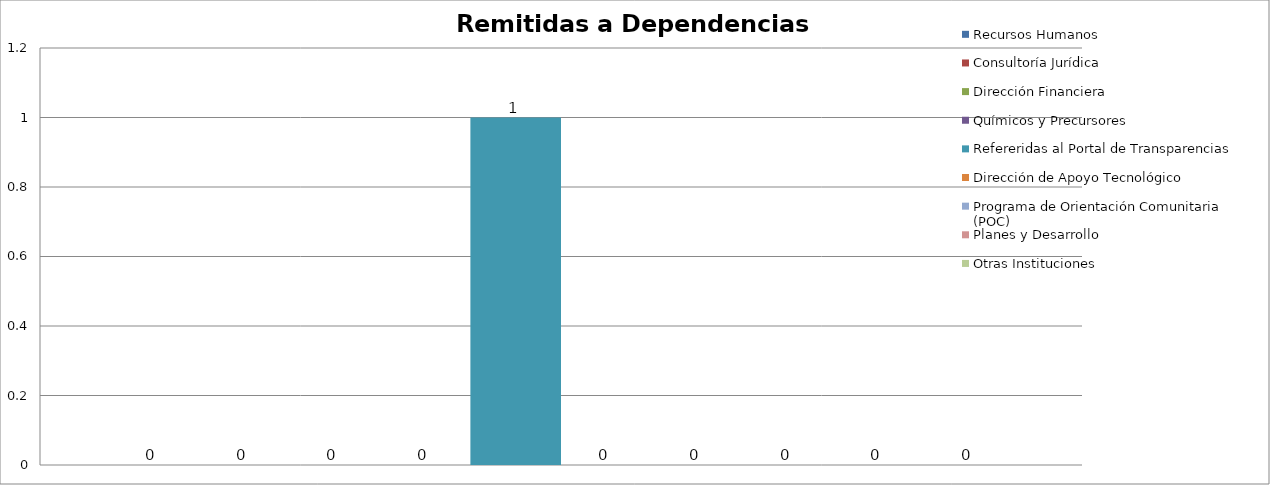
| Category | Recursos Humanos  | Consultoría Jurídica | Dirección Financiera | Químicos y Precursores | Refereridas al Portal de Transparencias | Dirección de Apoyo Tecnológico | Programa de Orientación Comunitaria (POC) | Planes y Desarrollo | Otras Instituciones | Incompleta |
|---|---|---|---|---|---|---|---|---|---|---|
| 0 | 0 | 0 | 0 | 0 | 1 | 0 | 0 | 0 | 0 | 0 |